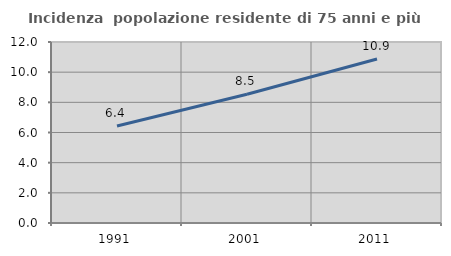
| Category | Incidenza  popolazione residente di 75 anni e più |
|---|---|
| 1991.0 | 6.43 |
| 2001.0 | 8.538 |
| 2011.0 | 10.876 |